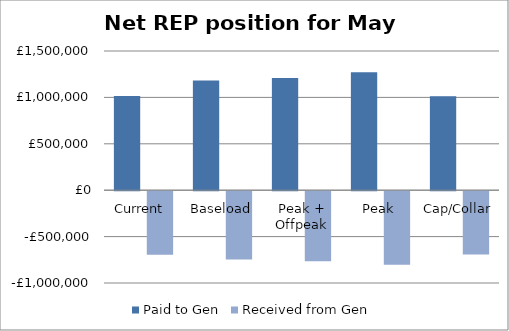
| Category | Paid to Gen | Received from Gen |
|---|---|---|
| Current  | 1013946.25 | -683820.45 |
| Baseload | 1181696.984 | -736714.848 |
| Peak + Offpeak | 1209583 | -754060.189 |
| Peak | 1270490.226 | -792071.933 |
| Cap/Collar | 1013625 | -682734.954 |